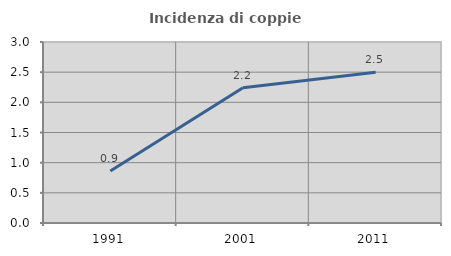
| Category | Incidenza di coppie miste |
|---|---|
| 1991.0 | 0.861 |
| 2001.0 | 2.241 |
| 2011.0 | 2.5 |